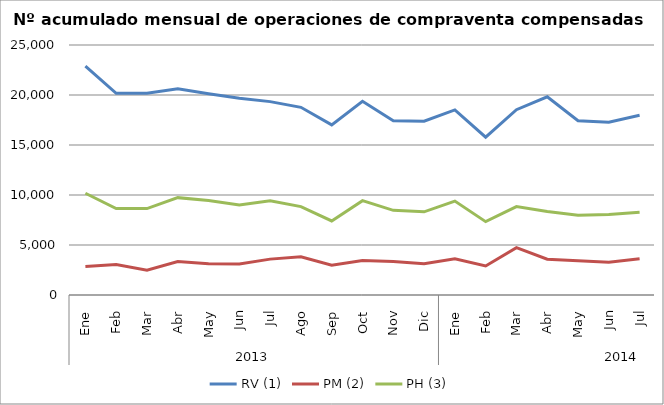
| Category | RV (1) | PM (2) | PH (3) |
|---|---|---|---|
| 0 | 22894 | 2853 | 10176 |
| 1 | 20174 | 3047 | 8641 |
| 2 | 20169 | 2472 | 8638 |
| 3 | 20616 | 3350 | 9736 |
| 4 | 20126 | 3117 | 9441 |
| 5 | 19686 | 3099 | 9000 |
| 6 | 19337 | 3588 | 9415 |
| 7 | 18769 | 3829 | 8838 |
| 8 | 17015 | 2969 | 7402 |
| 9 | 19371 | 3453 | 9435 |
| 10 | 17427 | 3359 | 8465 |
| 11 | 17377 | 3135 | 8315 |
| 12 | 18515 | 3629 | 9396 |
| 13 | 15776 | 2899 | 7337 |
| 14 | 18527 | 4739 | 8846 |
| 15 | 19824 | 3575 | 8345 |
| 16 | 17431 | 3429 | 7965 |
| 17 | 17272 | 3273 | 8041 |
| 18 | 17970 | 3623 | 8279 |